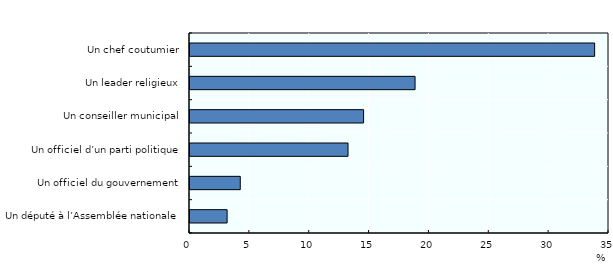
| Category | Series 0 |
|---|---|
| Un député à l’Assemblée nationale | 3.1 |
| Un officiel du gouvernement | 4.2 |
| Un officiel d’un parti politique | 13.2 |
| Un conseiller municipal | 14.5 |
| Un leader religieux | 18.8 |
| Un chef coutumier | 33.8 |